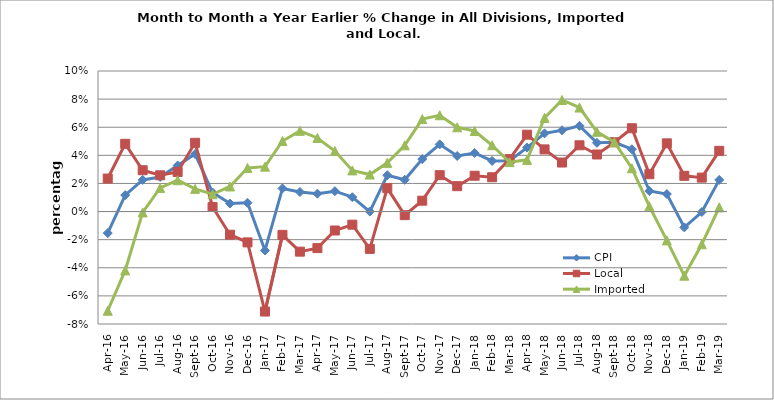
| Category | CPI | Local | Imported |
|---|---|---|---|
| 2016-04-01 | -0.015 | 0.023 | -0.071 |
| 2016-05-01 | 0.012 | 0.048 | -0.042 |
| 2016-06-01 | 0.023 | 0.029 | -0.001 |
| 2016-07-01 | 0.025 | 0.026 | 0.017 |
| 2016-08-01 | 0.033 | 0.028 | 0.022 |
| 2016-09-01 | 0.041 | 0.049 | 0.016 |
| 2016-10-01 | 0.014 | 0.003 | 0.012 |
| 2016-11-01 | 0.006 | -0.016 | 0.018 |
| 2016-12-01 | 0.006 | -0.022 | 0.031 |
| 2017-01-01 | -0.028 | -0.071 | 0.032 |
| 2017-02-01 | 0.016 | -0.017 | 0.05 |
| 2017-03-01 | 0.014 | -0.029 | 0.057 |
| 2017-04-01 | 0.013 | -0.026 | 0.052 |
| 2017-05-01 | 0.015 | -0.013 | 0.043 |
| 2017-06-01 | 0.01 | -0.009 | 0.029 |
| 2017-07-01 | 0 | -0.027 | 0.026 |
| 2017-08-01 | 0.026 | 0.017 | 0.035 |
| 2017-09-01 | 0.023 | -0.003 | 0.047 |
| 2017-10-01 | 0.037 | 0.008 | 0.066 |
| 2017-11-01 | 0.048 | 0.026 | 0.069 |
| 2017-12-01 | 0.04 | 0.018 | 0.06 |
| 2018-01-01 | 0.042 | 0.025 | 0.057 |
| 2018-02-01 | 0.036 | 0.024 | 0.047 |
| 2018-03-01 | 0.036 | 0.037 | 0.035 |
| 2018-04-01 | 0.045 | 0.055 | 0.037 |
| 2018-05-01 | 0.056 | 0.044 | 0.067 |
| 2018-06-01 | 0.058 | 0.035 | 0.079 |
| 2018-07-01 | 0.061 | 0.047 | 0.074 |
| 2018-08-01 | 0.049 | 0.041 | 0.057 |
| 2018-09-01 | 0.049 | 0.049 | 0.049 |
| 2018-10-01 | 0.044 | 0.059 | 0.031 |
| 2018-11-01 | 0.015 | 0.027 | 0.004 |
| 2018-12-01 | 0.012 | 0.049 | -0.021 |
| 2019-01-01 | -0.011 | 0.025 | -0.046 |
| 2019-02-01 | 0 | 0.024 | -0.023 |
| 2019-03-01 | 0.023 | 0.043 | 0.003 |